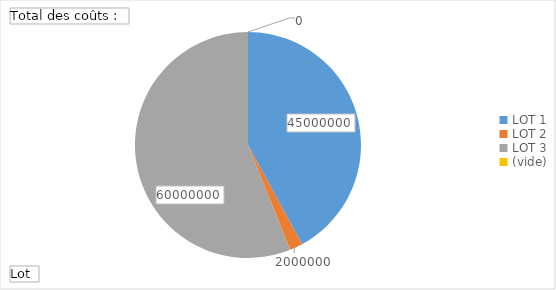
| Category | Total |
|---|---|
| LOT 1 | 45000000 |
| LOT 2 | 2000000 |
| LOT 3 | 60000000 |
| (vide) | 0 |